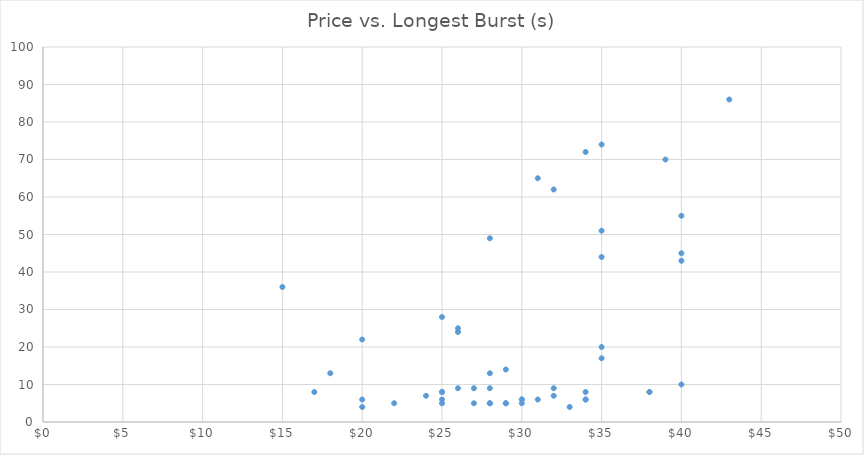
| Category | Longest Burst (s) |
|---|---|
| 31.0 | 65 |
| 28.0 | 49 |
| 26.0 | 25 |
| 35.0 | 20 |
| 34.0 | 8 |
| 25.0 | 5 |
| 29.0 | 5 |
| 28.0 | 5 |
| 17.0 | 8 |
| 20.0 | 4 |
| 29.0 | 5 |
| 26.0 | 24 |
| 30.0 | 5 |
| 30.0 | 6 |
| 35.0 | 17 |
| 40.0 | 10 |
| 34.0 | 6 |
| 32.0 | 7 |
| 26.0 | 9 |
| 43.0 | 86 |
| 35.0 | 51 |
| 35.0 | 44 |
| 35.0 | 74 |
| 38.0 | 8 |
| 31.0 | 6 |
| 20.0 | 6 |
| 27.0 | 9 |
| 25.0 | 28 |
| 30.0 | 6 |
| 33.0 | 4 |
| 32.0 | 62 |
| 28.0 | 9 |
| 39.0 | 70 |
| 38.0 | 8 |
| 40.0 | 43 |
| 40.0 | 45 |
| 32.0 | 9 |
| 27.0 | 5 |
| 15.0 | 36 |
| 34.0 | 72 |
| 18.0 | 13 |
| 25.0 | 8 |
| 20.0 | 22 |
| 34.0 | 6 |
| 40.0 | 55 |
| 28.0 | 5 |
| 25.0 | 6 |
| 24.0 | 7 |
| 25.0 | 8 |
| 22.0 | 5 |
| 29.0 | 14 |
| 28.0 | 13 |